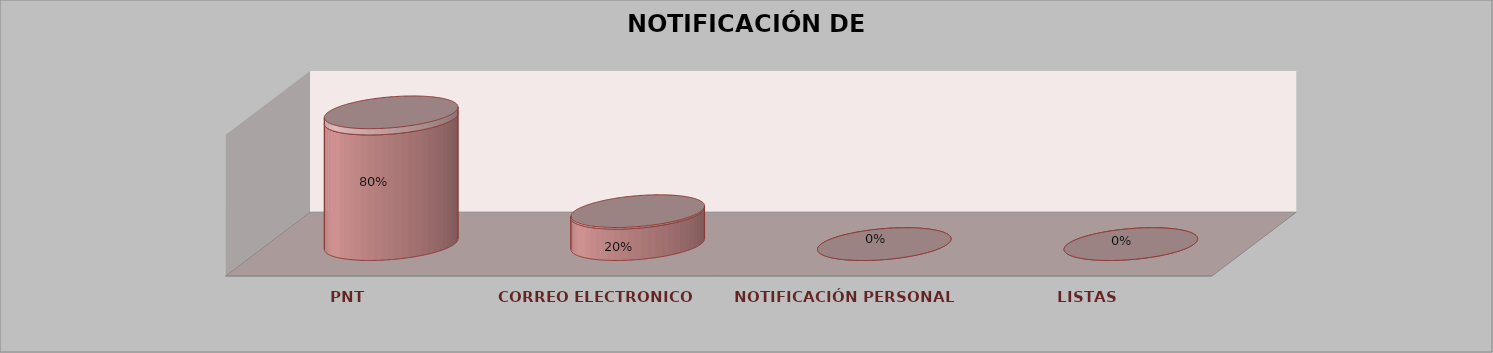
| Category | Series 0 | Series 1 | Series 2 | Series 3 | Series 4 |
|---|---|---|---|---|---|
| PNT |  |  |  | 16 | 0.8 |
| CORREO ELECTRONICO |  |  |  | 4 | 0.2 |
| NOTIFICACIÓN PERSONAL |  |  |  | 0 | 0 |
| LISTAS |  |  |  | 0 | 0 |